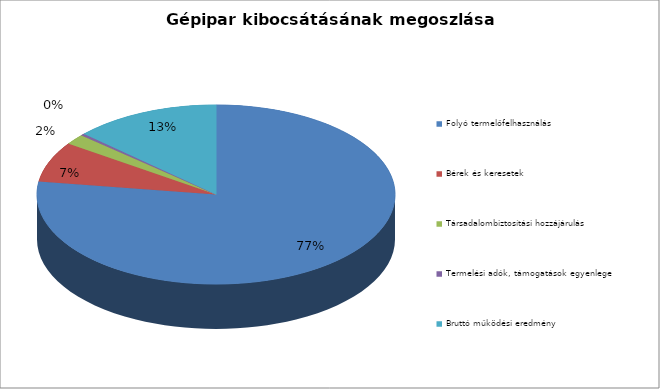
| Category | Series 0 |
|---|---|
| Folyó termelőfelhasználás | 8799847 |
| Bérek és keresetek | 826484 |
| Társadalombiztosítási hozzájárulás | 212642 |
| Termelési adók, támogatások egyenlege | 37859 |
| Bruttó működési eredmény | 1501306 |